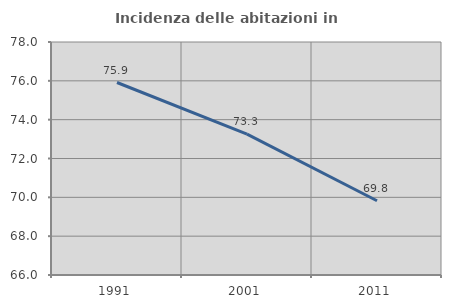
| Category | Incidenza delle abitazioni in proprietà  |
|---|---|
| 1991.0 | 75.914 |
| 2001.0 | 73.256 |
| 2011.0 | 69.822 |